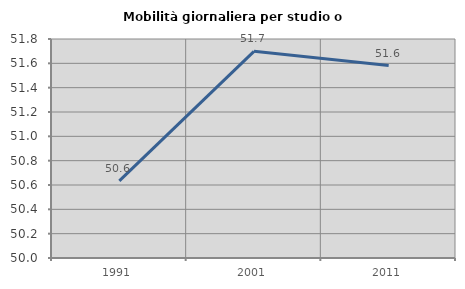
| Category | Mobilità giornaliera per studio o lavoro |
|---|---|
| 1991.0 | 50.634 |
| 2001.0 | 51.698 |
| 2011.0 | 51.582 |